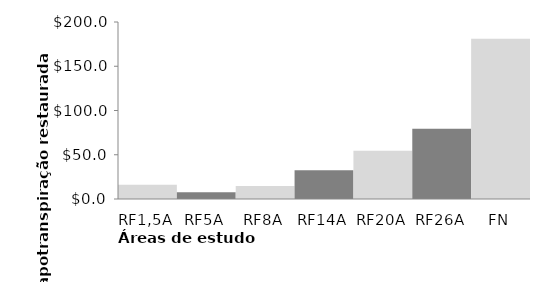
| Category | Series 0 |
|---|---|
| RF1,5A | 16.072 |
| RF5A | 7.568 |
| RF8A | 14.646 |
| RF14A | 32.377 |
| RF20A | 54.492 |
| RF26A | 79.289 |
| FN | 181.049 |